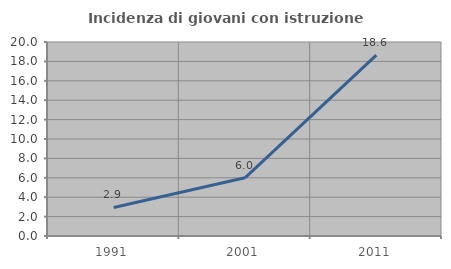
| Category | Incidenza di giovani con istruzione universitaria |
|---|---|
| 1991.0 | 2.941 |
| 2001.0 | 6 |
| 2011.0 | 18.644 |